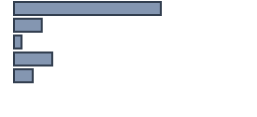
| Category | 47,2 |
|---|---|
| 0 | 61.439 |
| 1 | 11.591 |
| 2 | 3.182 |
| 3 | 15.985 |
| 4 | 7.803 |
| 5 | 0 |